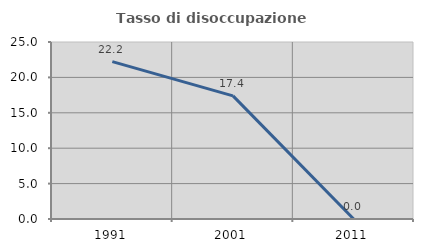
| Category | Tasso di disoccupazione giovanile  |
|---|---|
| 1991.0 | 22.222 |
| 2001.0 | 17.391 |
| 2011.0 | 0 |